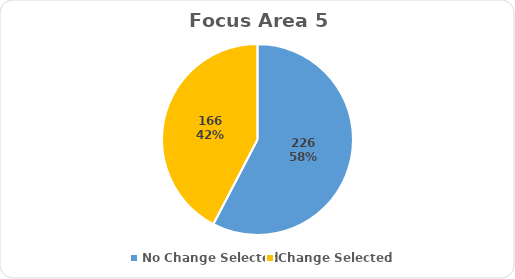
| Category | Series 0 |
|---|---|
| No Change Selected | 226 |
| Change Selected | 166 |